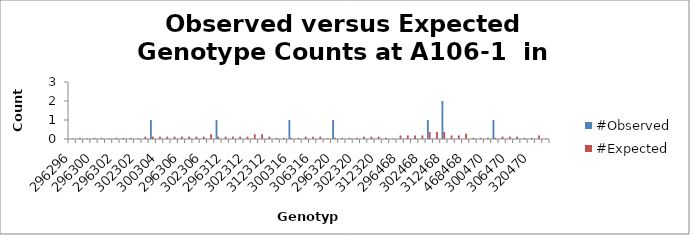
| Category | #Observed | #Expected |
|---|---|---|
| 296296.0 | 0 | 0.031 |
| 296298.0 | 0 | 0.062 |
| 298298.0 | 0 | 0.031 |
| 296300.0 | 0 | 0.062 |
| 298300.0 | 0 | 0.062 |
| 300300.0 | 0 | 0.031 |
| 296302.0 | 0 | 0.062 |
| 298302.0 | 0 | 0.062 |
| 300302.0 | 0 | 0.062 |
| 302302.0 | 0 | 0.031 |
| 296304.0 | 0 | 0.125 |
| 298304.0 | 1 | 0.125 |
| 300304.0 | 0 | 0.125 |
| 302304.0 | 0 | 0.125 |
| 304304.0 | 0 | 0.125 |
| 296306.0 | 0 | 0.125 |
| 298306.0 | 0 | 0.125 |
| 300306.0 | 0 | 0.125 |
| 302306.0 | 0 | 0.125 |
| 304306.0 | 0 | 0.25 |
| 306306.0 | 1 | 0.125 |
| 296312.0 | 0 | 0.125 |
| 298312.0 | 0 | 0.125 |
| 300312.0 | 0 | 0.125 |
| 302312.0 | 0 | 0.125 |
| 304312.0 | 0 | 0.25 |
| 306312.0 | 0 | 0.25 |
| 312312.0 | 0 | 0.125 |
| 296316.0 | 0 | 0.062 |
| 298316.0 | 0 | 0.062 |
| 300316.0 | 1 | 0.062 |
| 302316.0 | 0 | 0.062 |
| 304316.0 | 0 | 0.125 |
| 306316.0 | 0 | 0.125 |
| 312316.0 | 0 | 0.125 |
| 316316.0 | 0 | 0.031 |
| 296320.0 | 1 | 0.062 |
| 298320.0 | 0 | 0.062 |
| 300320.0 | 0 | 0.062 |
| 302320.0 | 0 | 0.062 |
| 304320.0 | 0 | 0.125 |
| 306320.0 | 0 | 0.125 |
| 312320.0 | 0 | 0.125 |
| 316320.0 | 0 | 0.062 |
| 320320.0 | 0 | 0.031 |
| 296468.0 | 0 | 0.188 |
| 298468.0 | 0 | 0.188 |
| 300468.0 | 0 | 0.188 |
| 302468.0 | 0 | 0.188 |
| 304468.0 | 1 | 0.375 |
| 306468.0 | 0 | 0.375 |
| 312468.0 | 2 | 0.375 |
| 316468.0 | 0 | 0.188 |
| 320468.0 | 0 | 0.188 |
| 468468.0 | 0 | 0.281 |
| 296470.0 | 0 | 0.062 |
| 298470.0 | 0 | 0.062 |
| 300470.0 | 0 | 0.062 |
| 302470.0 | 1 | 0.062 |
| 304470.0 | 0 | 0.125 |
| 306470.0 | 0 | 0.125 |
| 312470.0 | 0 | 0.125 |
| 316470.0 | 0 | 0.062 |
| 320470.0 | 0 | 0.062 |
| 468470.0 | 0 | 0.188 |
| 470470.0 | 0 | 0.031 |